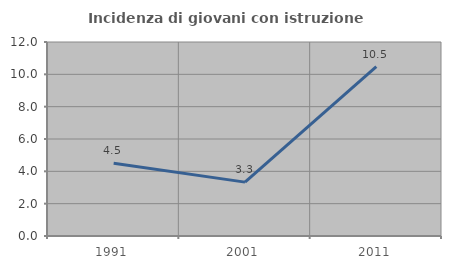
| Category | Incidenza di giovani con istruzione universitaria |
|---|---|
| 1991.0 | 4.494 |
| 2001.0 | 3.333 |
| 2011.0 | 10.476 |